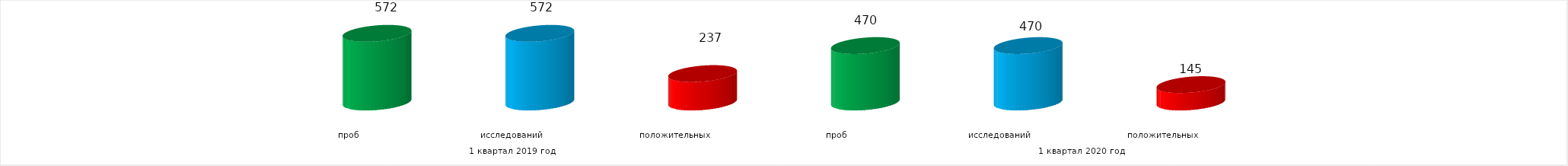
| Category | Series 4 |
|---|---|
| 0 | 572 |
| 1 | 572 |
| 2 | 237 |
| 3 | 470 |
| 4 | 470 |
| 5 | 145 |